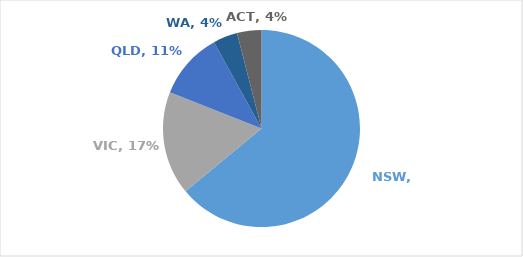
| Category | Series 0 |
|---|---|
| NSW | 0.64 |
| VIC | 0.17 |
| QLD | 0.11 |
| WA | 0.04 |
| ACT | 0.04 |